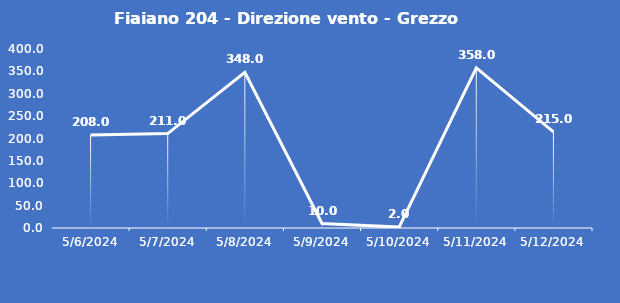
| Category | Fiaiano 204 - Direzione vento - Grezzo (°N) |
|---|---|
| 5/6/24 | 208 |
| 5/7/24 | 211 |
| 5/8/24 | 348 |
| 5/9/24 | 10 |
| 5/10/24 | 2 |
| 5/11/24 | 358 |
| 5/12/24 | 215 |